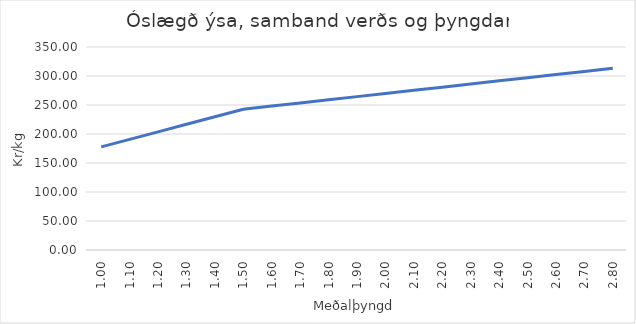
| Category | Series 0 |
|---|---|
| 1.0 | 177.77 |
| 1.1 | 190.752 |
| 1.2 | 203.733 |
| 1.3 | 216.715 |
| 1.4 | 229.697 |
| 1.5 | 242.678 |
| 1.6 | 248.116 |
| 1.7 | 253.554 |
| 1.8 | 258.991 |
| 1.9 | 264.429 |
| 2.0 | 269.867 |
| 2.1 | 275.304 |
| 2.2 | 280.742 |
| 2.3 | 286.18 |
| 2.4 | 291.617 |
| 2.5 | 297.055 |
| 2.6 | 302.493 |
| 2.7 | 307.931 |
| 2.8 | 313.368 |